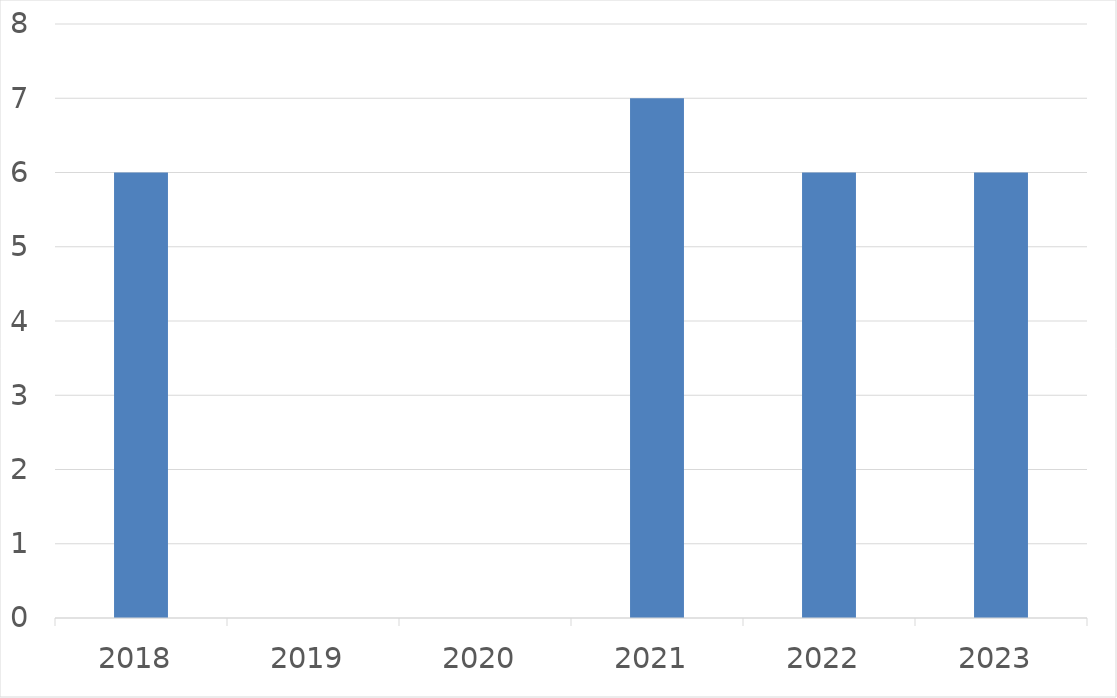
| Category | Series 0 |
|---|---|
| 2018 | 6 |
| 2019 | 0 |
| 2020 | 0 |
| 2021 | 7 |
| 2022 | 6 |
| 2023 | 6 |